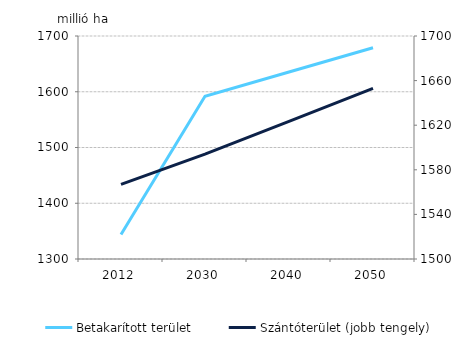
| Category | Betakarított terület |
|---|---|
| 2012.0 | 1344 |
| 2030.0 | 1592 |
| 2040.0 | 1635.5 |
| 2050.0 | 1679 |